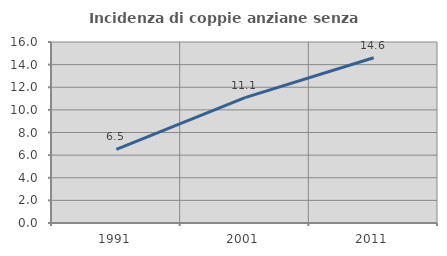
| Category | Incidenza di coppie anziane senza figli  |
|---|---|
| 1991.0 | 6.514 |
| 2001.0 | 11.08 |
| 2011.0 | 14.606 |